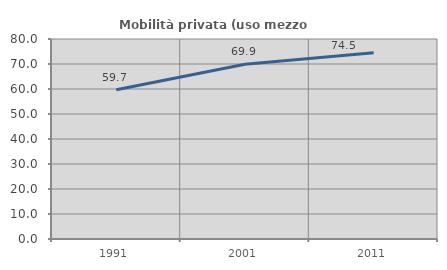
| Category | Mobilità privata (uso mezzo privato) |
|---|---|
| 1991.0 | 59.663 |
| 2001.0 | 69.88 |
| 2011.0 | 74.472 |